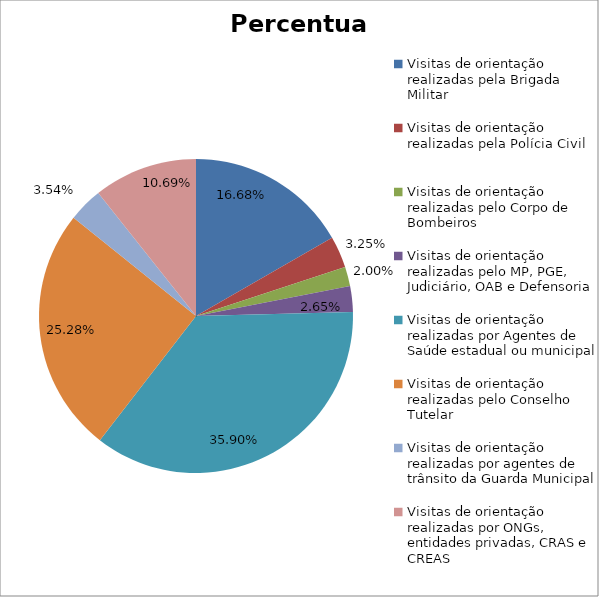
| Category | Percentual |
|---|---|
| Visitas de orientação realizadas pela Brigada Militar | 0.167 |
| Visitas de orientação realizadas pela Polícia Civil | 0.033 |
| Visitas de orientação realizadas pelo Corpo de Bombeiros | 0.02 |
| Visitas de orientação realizadas pelo MP, PGE, Judiciário, OAB e Defensoria | 0.027 |
| Visitas de orientação realizadas por Agentes de Saúde estadual ou municipal | 0.359 |
| Visitas de orientação realizadas pelo Conselho Tutelar | 0.253 |
| Visitas de orientação realizadas por agentes de trânsito da Guarda Municipal | 0.035 |
| Visitas de orientação realizadas por ONGs, entidades privadas, CRAS e CREAS | 0.107 |